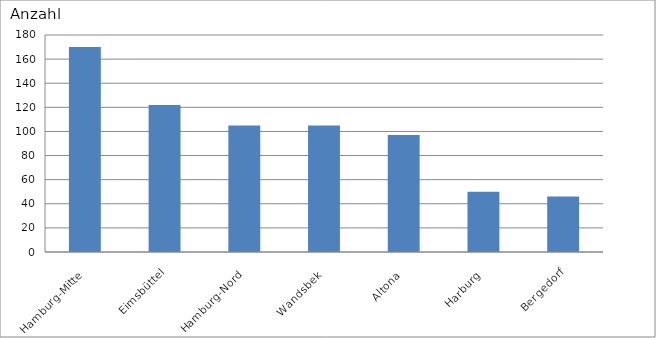
| Category | Hamburg-Mitte |
|---|---|
| Hamburg-Mitte | 170 |
| Eimsbüttel | 122 |
| Hamburg-Nord | 105 |
| Wandsbek | 105 |
| Altona | 97 |
| Harburg | 50 |
| Bergedorf | 46 |